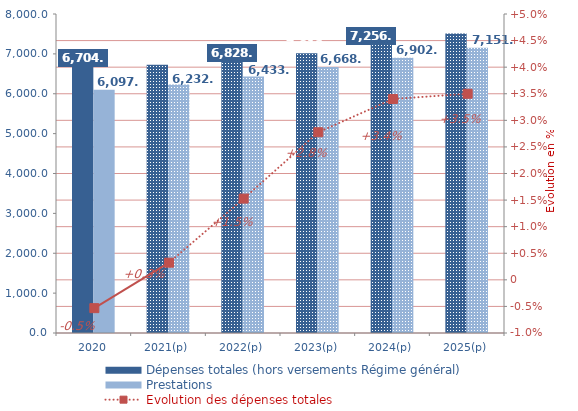
| Category | Dépenses totales (hors versements Régime général) | Prestations |
|---|---|---|
| 2020 | 6704.187 | 6097.357 |
| 2021(p) | 6725.802 | 6232.814 |
| 2022(p) | 6828.56 | 6433.506 |
| 2023(p) | 7018.111 | 6667.987 |
| 2024(p) | 7256.838 | 6901.953 |
| 2025(p) | 7510.825 | 7151.521 |